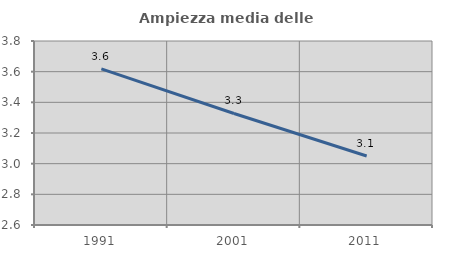
| Category | Ampiezza media delle famiglie |
|---|---|
| 1991.0 | 3.618 |
| 2001.0 | 3.327 |
| 2011.0 | 3.05 |